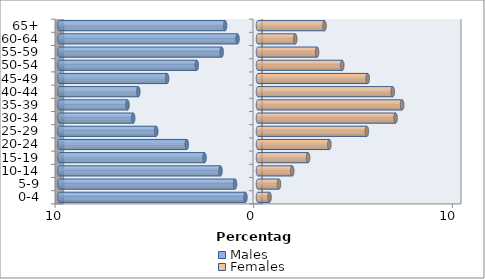
| Category | Males | Females |
|---|---|---|
| 0-4 | -0.633 | 0.582 |
| 5-9 | -1.155 | 1.055 |
| 10-14 | -1.891 | 1.723 |
| 15-19 | -2.69 | 2.522 |
| 20-24 | -3.584 | 3.592 |
| 25-29 | -5.124 | 5.481 |
| 30-34 | -6.283 | 6.925 |
| 35-39 | -6.568 | 7.255 |
| 40-44 | -6.025 | 6.781 |
| 45-49 | -4.574 | 5.524 |
| 50-54 | -3.081 | 4.242 |
| 55-59 | -1.828 | 2.974 |
| 60-64 | -1.032 | 1.876 |
| 65+ | -1.655 | 3.349 |